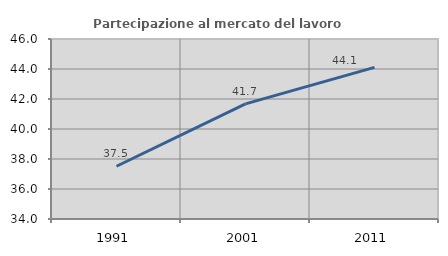
| Category | Partecipazione al mercato del lavoro  femminile |
|---|---|
| 1991.0 | 37.515 |
| 2001.0 | 41.678 |
| 2011.0 | 44.109 |